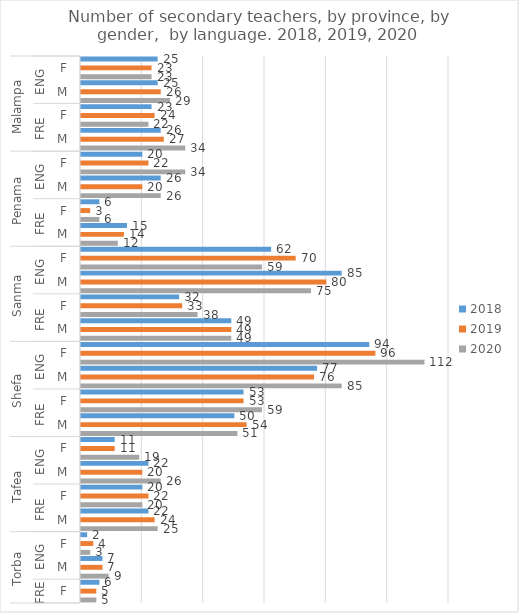
| Category | 2018 | 2019 | 2020 |
|---|---|---|---|
| 0 | 25 | 23 | 23 |
| 1 | 25 | 26 | 29 |
| 2 | 23 | 24 | 22 |
| 3 | 26 | 27 | 34 |
| 4 | 20 | 22 | 34 |
| 5 | 26 | 20 | 26 |
| 6 | 6 | 3 | 6 |
| 7 | 15 | 14 | 12 |
| 8 | 62 | 70 | 59 |
| 9 | 85 | 80 | 75 |
| 10 | 32 | 33 | 38 |
| 11 | 49 | 49 | 49 |
| 12 | 94 | 96 | 112 |
| 13 | 77 | 76 | 85 |
| 14 | 53 | 53 | 59 |
| 15 | 50 | 54 | 51 |
| 16 | 11 | 11 | 19 |
| 17 | 22 | 20 | 26 |
| 18 | 20 | 22 | 20 |
| 19 | 22 | 24 | 25 |
| 20 | 2 | 4 | 3 |
| 21 | 7 | 7 | 9 |
| 22 | 6 | 5 | 5 |